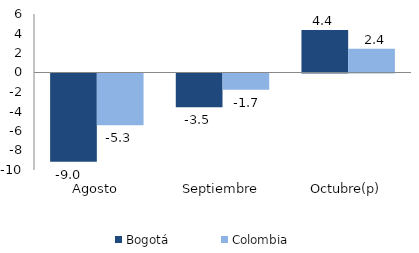
| Category | Bogotá | Colombia |
|---|---|---|
| Agosto | -9.039 | -5.307 |
| Septiembre | -3.471 | -1.672 |
| Octubre(p) | 4.371 | 2.425 |